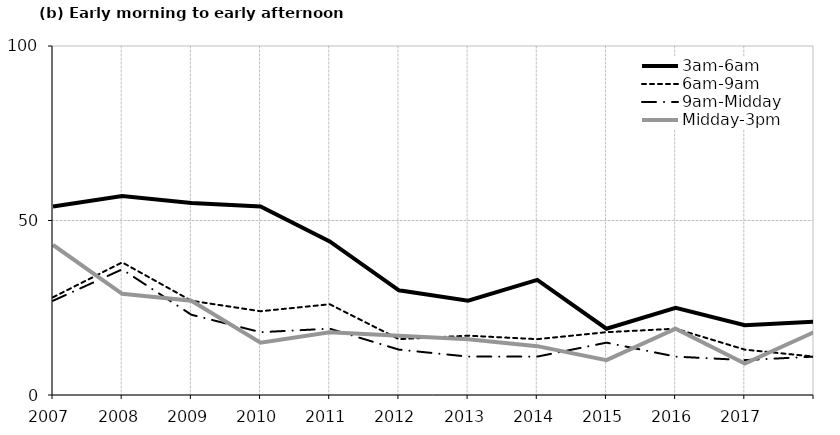
| Category | 3am-6am | 6am-9am | 9am-Midday | Midday-3pm |
|---|---|---|---|---|
| 2007.0 | 54 | 28 | 27 | 43 |
| 2008.0 | 57 | 38 | 36 | 29 |
| 2009.0 | 55 | 27 | 23 | 27 |
| 2010.0 | 54 | 24 | 18 | 15 |
| 2011.0 | 44 | 26 | 19 | 18 |
| 2012.0 | 30 | 16 | 13 | 17 |
| 2013.0 | 27 | 17 | 11 | 16 |
| 2014.0 | 33 | 16 | 11 | 14 |
| 2015.0 | 19 | 18 | 15 | 10 |
| 2016.0 | 25 | 19 | 11 | 19 |
| 2017.0 | 20 | 13 | 10 | 9 |